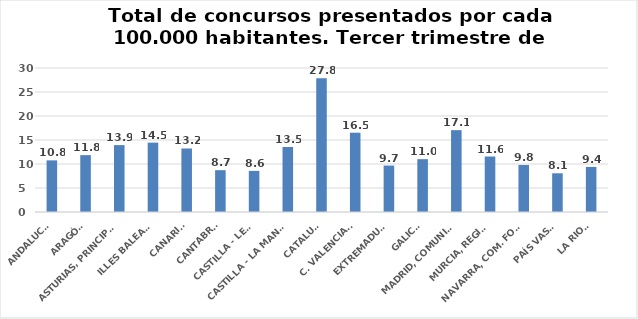
| Category | Series 0 |
|---|---|
| ANDALUCÍA | 10.76 |
| ARAGÓN | 11.846 |
| ASTURIAS, PRINCIPADO | 13.937 |
| ILLES BALEARS | 14.453 |
| CANARIAS | 13.233 |
| CANTABRIA | 8.715 |
| CASTILLA - LEÓN | 8.565 |
| CASTILLA - LA MANCHA | 13.546 |
| CATALUÑA | 27.842 |
| C. VALENCIANA | 16.52 |
| EXTREMADURA | 9.675 |
| GALICIA | 11.007 |
| MADRID, COMUNIDAD | 17.051 |
| MURCIA, REGIÓN | 11.558 |
| NAVARRA, COM. FORAL | 9.795 |
| PAÍS VASCO | 8.065 |
| LA RIOJA | 9.39 |